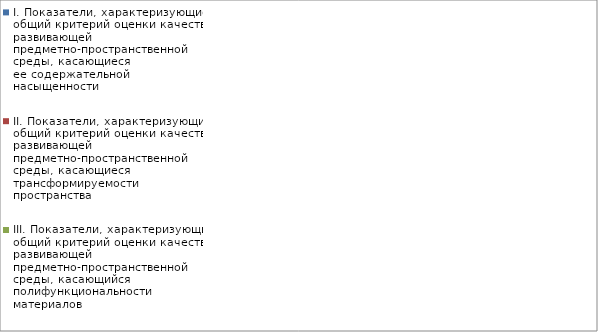
| Category | I. Показатели, характеризующие общий критерий оценки качества развивающей предметно-пространственной среды, касающиеся ее содержательной насыщенности | II. Показатели, характеризующие общий критерий оценки качества развивающей предметно-пространственной среды, касающиеся трансформируемости пространства | III. Показатели, характеризующие общий критерий оценки качества развивающей предметно-пространственной среды, касающийся полифункциональности материалов | IV. Показатели, характеризующие общий критерий оценки качества развивающей предметно-пространственной среды, касающиеся ее вариативности | V. Показатели, характеризующие общий критерий оценки качества развивающей предметно-пространственной среды, касающиеся ее доступности | VI. Показатели, характеризующие общий критерий оценки качества развивающей предметно-пространственной среды, касающиеся безопасности предметно-пространственной среды |
|---|---|---|---|---|---|---|
| Морячки | 1 | 0.833 | 0.778 | 1 | 1 | 0.8 |